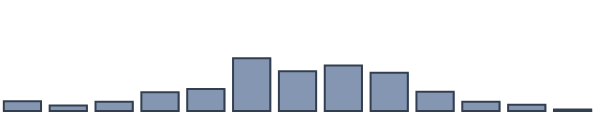
| Category | Series 0 |
|---|---|
| 0 | 3.492 |
| 1 | 1.986 |
| 2 | 3.291 |
| 3 | 6.756 |
| 4 | 7.958 |
| 5 | 19.045 |
| 6 | 14.294 |
| 7 | 16.395 |
| 8 | 13.8 |
| 9 | 6.922 |
| 10 | 3.291 |
| 11 | 2.228 |
| 12 | 0.542 |